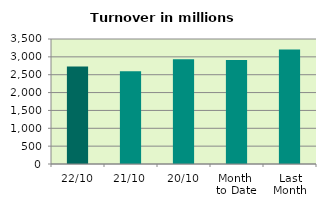
| Category | Series 0 |
|---|---|
| 22/10 | 2727.248 |
| 21/10 | 2598.841 |
| 20/10 | 2930.793 |
| Month 
to Date | 2913.58 |
| Last
Month | 3204.516 |